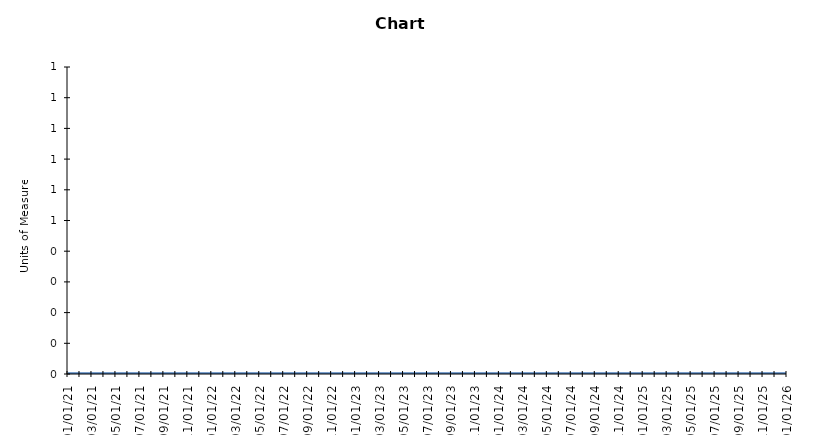
| Category | Data | Upper Goal | Lower Goal |
|---|---|---|---|
| 2021-01-01 |  | 0 | 0 |
| 2021-02-01 |  | 0 | 0 |
| 2021-03-01 |  | 0 | 0 |
| 2021-04-01 |  | 0 | 0 |
| 2021-05-01 |  | 0 | 0 |
| 2021-06-01 |  | 0 | 0 |
| 2021-07-01 |  | 0 | 0 |
| 2021-08-01 |  | 0 | 0 |
| 2021-09-01 |  | 0 | 0 |
| 2021-10-01 |  | 0 | 0 |
| 2021-11-01 |  | 0 | 0 |
| 2021-12-01 |  | 0 | 0 |
| 2022-01-01 |  | 0 | 0 |
| 2022-02-01 |  | 0 | 0 |
| 2022-03-01 |  | 0 | 0 |
| 2022-04-01 |  | 0 | 0 |
| 2022-05-01 |  | 0 | 0 |
| 2022-06-01 |  | 0 | 0 |
| 2022-07-01 |  | 0 | 0 |
| 2022-08-01 |  | 0 | 0 |
| 2022-09-01 |  | 0 | 0 |
| 2022-10-01 |  | 0 | 0 |
| 2022-11-01 |  | 0 | 0 |
| 2022-12-01 |  | 0 | 0 |
| 2023-01-01 |  | 0 | 0 |
| 2023-02-01 |  | 0 | 0 |
| 2023-03-01 |  | 0 | 0 |
| 2023-04-01 |  | 0 | 0 |
| 2023-05-01 |  | 0 | 0 |
| 2023-06-01 |  | 0 | 0 |
| 2023-07-01 |  | 0 | 0 |
| 2023-08-01 |  | 0 | 0 |
| 2023-09-01 |  | 0 | 0 |
| 2023-10-01 |  | 0 | 0 |
| 2023-11-01 |  | 0 | 0 |
| 2023-12-01 |  | 0 | 0 |
| 2024-01-01 |  | 0 | 0 |
| 2024-02-01 |  | 0 | 0 |
| 2024-03-01 |  | 0 | 0 |
| 2024-04-01 |  | 0 | 0 |
| 2024-05-01 |  | 0 | 0 |
| 2024-06-01 |  | 0 | 0 |
| 2024-07-01 |  | 0 | 0 |
| 2024-08-01 |  | 0 | 0 |
| 2024-09-01 |  | 0 | 0 |
| 2024-10-01 |  | 0 | 0 |
| 2024-11-01 |  | 0 | 0 |
| 2024-12-01 |  | 0 | 0 |
| 2025-01-01 |  | 0 | 0 |
| 2025-02-01 |  | 0 | 0 |
| 2025-03-01 |  | 0 | 0 |
| 2025-04-01 |  | 0 | 0 |
| 2025-05-01 |  | 0 | 0 |
| 2025-06-01 |  | 0 | 0 |
| 2025-07-01 |  | 0 | 0 |
| 2025-08-01 |  | 0 | 0 |
| 2025-09-01 |  | 0 | 0 |
| 2025-10-01 |  | 0 | 0 |
| 2025-11-01 |  | 0 | 0 |
| 2025-12-01 |  | 0 | 0 |
| 2026-01-01 |  | 0 | 0 |